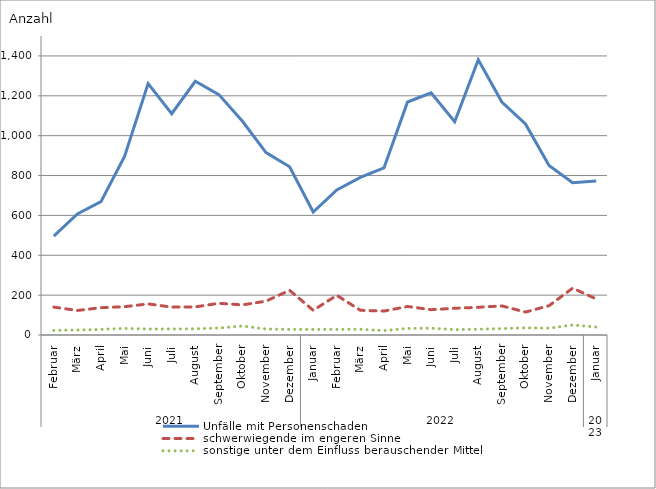
| Category | Unfälle mit Personenschaden | schwerwiegende im engeren Sinne | sonstige unter dem Einfluss berauschender Mittel |
|---|---|---|---|
| 0 | 496 | 140 | 23 |
| 1 | 607 | 123 | 25 |
| 2 | 669 | 137 | 28 |
| 3 | 896 | 142 | 33 |
| 4 | 1261 | 156 | 30 |
| 5 | 1110 | 140 | 30 |
| 6 | 1273 | 141 | 31 |
| 7 | 1206 | 159 | 35 |
| 8 | 1072 | 151 | 45 |
| 9 | 915 | 170 | 30 |
| 10 | 844 | 224 | 28 |
| 11 | 617 | 124 | 28 |
| 12 | 728 | 199 | 28 |
| 13 | 791 | 124 | 29 |
| 14 | 838 | 120 | 22 |
| 15 | 1169 | 143 | 33 |
| 16 | 1215 | 127 | 34 |
| 17 | 1070 | 134 | 27 |
| 18 | 1381 | 139 | 29 |
| 19 | 1169 | 146 | 32 |
| 20 | 1059 | 115 | 36 |
| 21 | 850 | 147 | 34 |
| 22 | 764 | 235 | 50 |
| 23 | 773 | 181 | 40 |